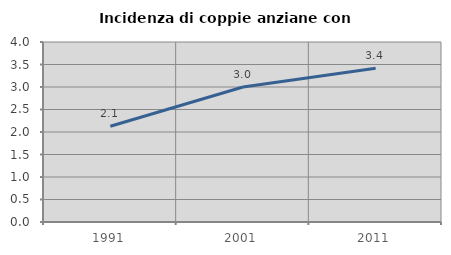
| Category | Incidenza di coppie anziane con figli |
|---|---|
| 1991.0 | 2.128 |
| 2001.0 | 3 |
| 2011.0 | 3.419 |